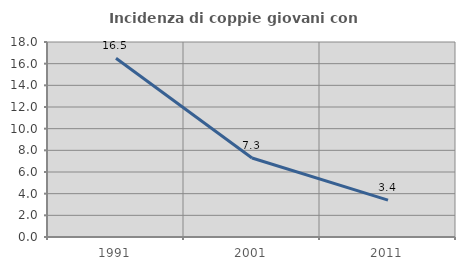
| Category | Incidenza di coppie giovani con figli |
|---|---|
| 1991.0 | 16.495 |
| 2001.0 | 7.292 |
| 2011.0 | 3.409 |